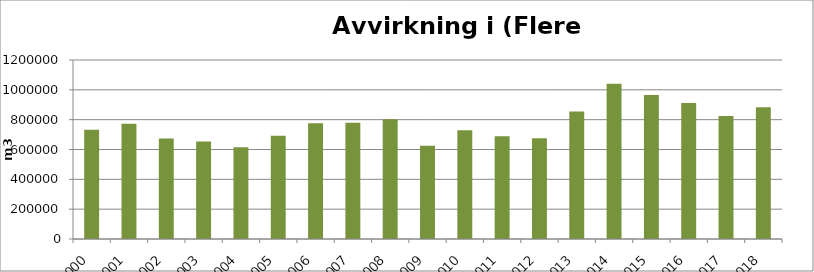
| Category | Totalt |
|---|---|
| 2000 | 731617 |
| 2001 | 772954 |
| 2002 | 674141 |
| 2003 | 654035 |
| 2004 | 615707 |
| 2005 | 691787 |
| 2006 | 776643 |
| 2007 | 779950 |
| 2008 | 802329 |
| 2009 | 625941 |
| 2010 | 728265 |
| 2011 | 688860 |
| 2012 | 675316 |
| 2013 | 855104 |
| 2014 | 1040795 |
| 2015 | 965335 |
| 2016 | 911626 |
| 2017 | 825392 |
| 2018 | 883486 |